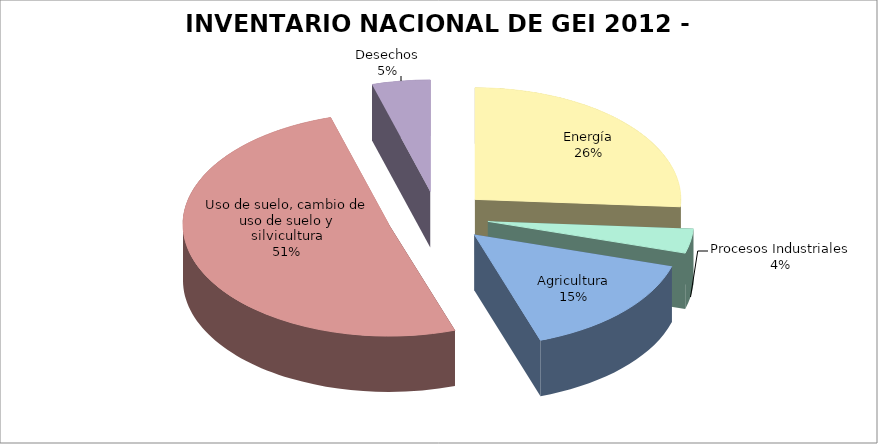
| Category | Series 0 |
|---|---|
| Energía | 44637.814 |
| Procesos Industriales | 6063.538 |
| Agricultura | 26043.677 |
| Uso de suelo, cambio de uso de suelo y silvicultura | 86741.95 |
| Desechos | 7822.59 |